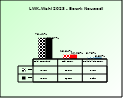
| Category | 2018 | 2023 |
|---|---|---|
| Bgld. Bauernbund | 0.784 | 0.786 |
| SPÖ Bauern | 0.158 | 0.16 |
| Freiheitliche Bauern | 0.057 | 0.054 |